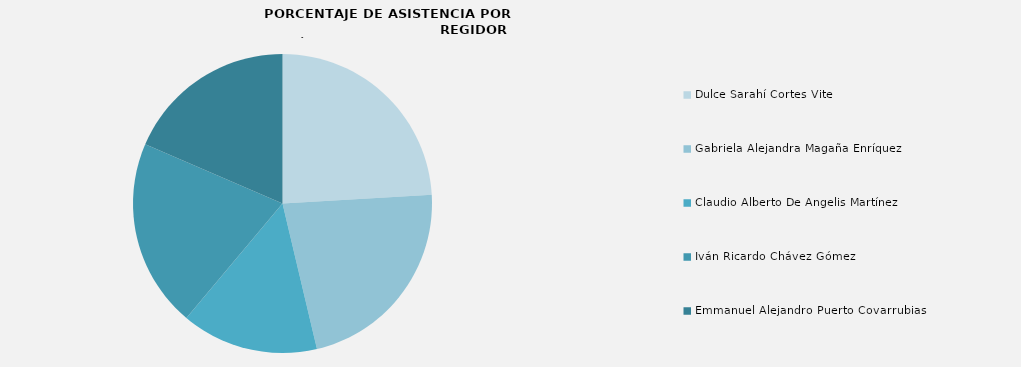
| Category | Series 0 |
|---|---|
| Dulce Sarahí Cortes Vite  | 100 |
| Gabriela Alejandra Magaña Enríquez | 92.308 |
| Claudio Alberto De Angelis Martínez | 61.538 |
| Iván Ricardo Chávez Gómez | 84.615 |
| Emmanuel Alejandro Puerto Covarrubias | 76.923 |